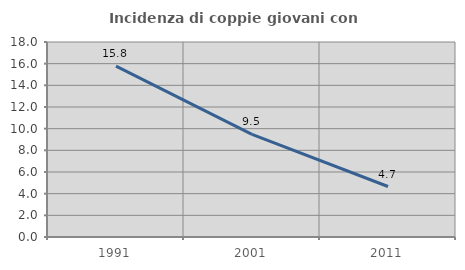
| Category | Incidenza di coppie giovani con figli |
|---|---|
| 1991.0 | 15.774 |
| 2001.0 | 9.465 |
| 2011.0 | 4.661 |